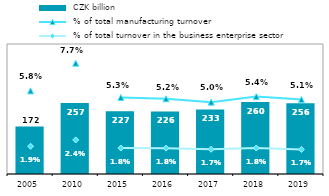
| Category |  CZK billion |
|---|---|
| 2005.0 | 172.086 |
| 2010.0 | 256.64 |
| 2015.0 | 226.828 |
| 2016.0 | 226.336 |
| 2017.0 | 233.272 |
| 2018.0 | 260.301 |
| 2019.0 | 256.181 |